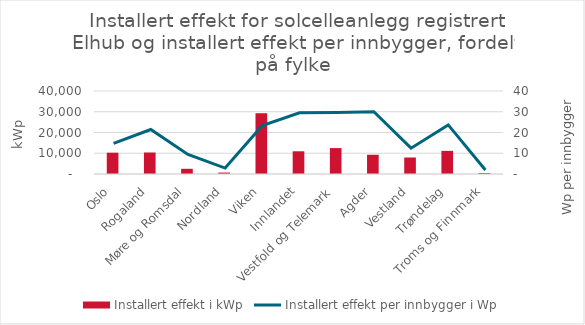
| Category | Installert effekt i kWp |
|---|---|
| Oslo | 10267 |
| Rogaland | 10355 |
| Møre og Romsdal | 2502 |
| Nordland | 690 |
| Viken | 29282 |
| Innlandet | 10945 |
| Vestfold og Telemark | 12488 |
| Agder | 9269 |
| Vestland | 7952 |
| Trøndelag | 11150 |
| Troms og Finnmark | 473 |